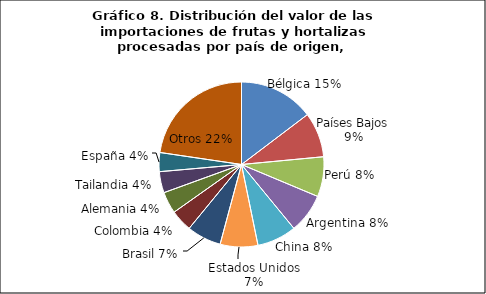
| Category | Series 0 |
|---|---|
| Bélgica | 9289401.86 |
| Países Bajos | 5576953.33 |
| Perú | 4944158.17 |
| Argentina | 4901416.12 |
| China | 4888850.99 |
| Estados Unidos | 4671668.84 |
| Brasil | 4271213.55 |
| Colombia | 2703723.82 |
| Alemania | 2692207.55 |
| Tailandia | 2627234.94 |
| España | 2354254.88 |
| Otros | 14343092.83 |